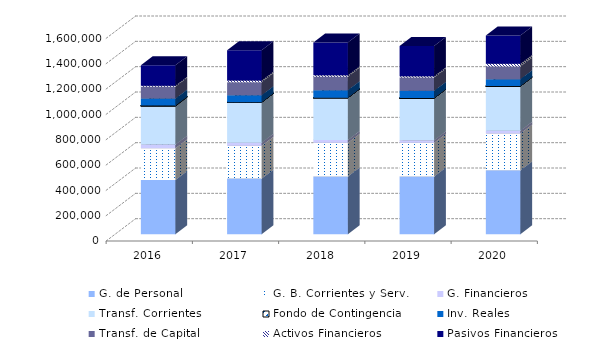
| Category | G. de Personal | G. B. Corrientes y Serv. | G. Financieros | Transf. Corrientes | Fondo de Contingencia | Inv. Reales | Transf. de Capital | Activos Financieros | Pasivos Financieros |
|---|---|---|---|---|---|---|---|---|---|
| 2016.0 | 429004.83 | 250410.6 | 28616.42 | 304708.96 | 3132.77 | 55579.04 | 94165.44 | 7912.49 | 160659.45 |
| 2017.0 | 440058.89 | 259317.69 | 24101.25 | 318902.58 | 1 | 55701.46 | 102564.13 | 12791.54 | 239136.46 |
| 2018.0 | 456311.97 | 266147.25 | 21592.96 | 333759.71 | 1.17 | 60120.86 | 106241.71 | 11093.05 | 258624.32 |
| 2019.0 | 456311.97 | 266147.25 | 20613.51 | 332276.21 | 1.17 | 57518.51 | 104211.31 | 11093.05 | 238888.3 |
| 2020.0 | 504997.74 | 290355.06 | 22035.15 | 352276.39 | 156.8 | 54913.62 | 100007.88 | 21045.19 | 224040.29 |